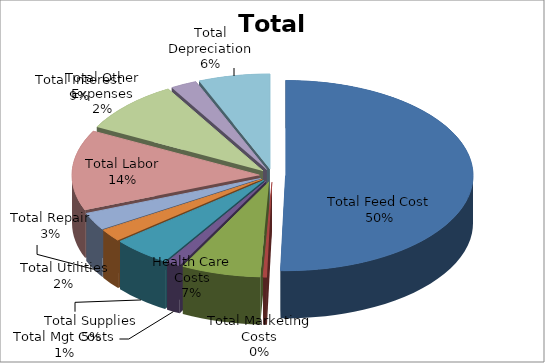
| Category | Series 0 |
|---|---|
| Total Feed Cost | 1001055 |
| Total Marketing Costs | 6414 |
| Health Care Costs | 136102 |
| Total Mgt Costs | 24447 |
| Total Supplies | 100919 |
| Total Utilities | 41851 |
| Total Repair | 59111 |
| Total Labor | 270922 |
| Total Interest | 176516 |
| Total Other Expenses | 45109 |
| Total Depreciation | 122642 |